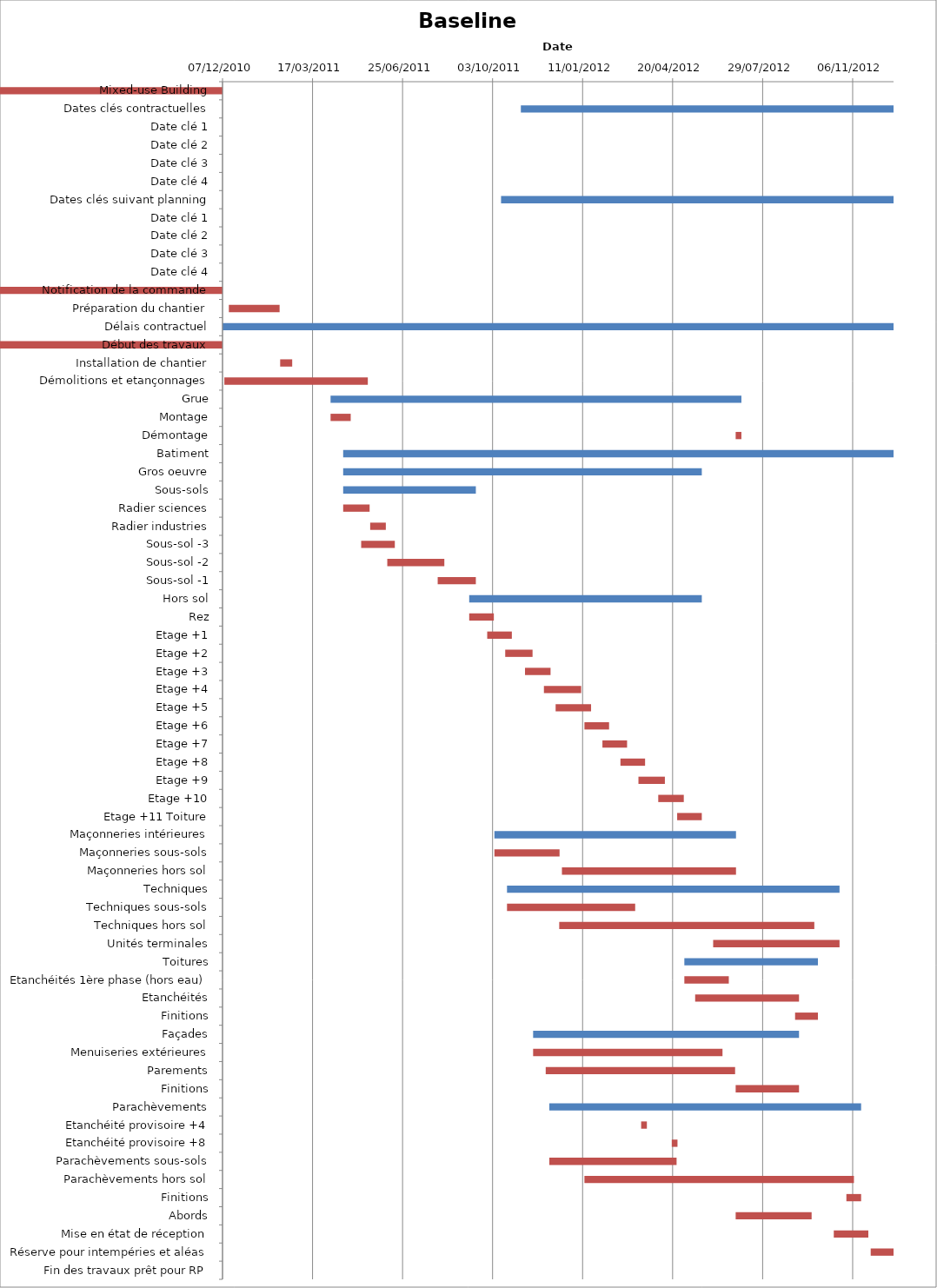
| Category | Baseline start | Actual duration |
|---|---|---|
| Mixed-use Building | 40519.333 | -0.625 |
| Dates clés contractuelles | 40850.708 | 414 |
| Date clé 1 | 40850.708 | 0 |
| Date clé 2 | 41094.708 | 0 |
| Date clé 3 | 41143.708 | 0 |
| Date clé 4 | 41264.708 | 0 |
| Dates clés suivant planning | 40828.708 | 436 |
| Date clé 1 | 40828.708 | 0 |
| Date clé 2 | 41086.708 | 0 |
| Date clé 3 | 41138.708 | 0 |
| Date clé 4 | 41264.708 | 0 |
| Notification de la commande | 40519.333 | -0.625 |
| Préparation du chantier | 40526.333 | 56.375 |
| Délais contractuel | 40519.333 | 745.375 |
| Début des travaux | 40519.333 | -0.625 |
| Installation de chantier | 40583.333 | 13.375 |
| Démolitions et etançonnages | 40521.333 | 159.375 |
| Grue | 40639.333 | 456.375 |
| Montage | 40639.333 | 22.375 |
| Démontage | 41089.333 | 6.375 |
| Batiment | 40653.333 | 611.375 |
| Gros oeuvre | 40653.333 | 398.375 |
| Sous-sols | 40653.333 | 147.375 |
| Radier sciences | 40653.333 | 29.375 |
| Radier industries | 40683.333 | 17.375 |
| Sous-sol -3 | 40673.333 | 37.375 |
| Sous-sol -2 | 40702.333 | 63.375 |
| Sous-sol -1 | 40758.333 | 42.375 |
| Hors sol | 40793.333 | 258.375 |
| Rez | 40793.333 | 27.375 |
| Etage +1 | 40813.333 | 27.375 |
| Etage +2 | 40833.333 | 30.375 |
| Etage +3 | 40855.333 | 28.375 |
| Etage +4 | 40876.333 | 41.375 |
| Etage +5 | 40889.333 | 39.375 |
| Etage +6 | 40921.333 | 27.375 |
| Etage +7 | 40941.333 | 27.375 |
| Etage +8 | 40961.333 | 27.375 |
| Etage +9 | 40981.333 | 29.375 |
| Etage +10 | 41003.333 | 28.375 |
| Etage +11 Toiture | 41024.333 | 27.375 |
| Maçonneries intérieures | 40821.333 | 268.375 |
| Maçonneries sous-sols | 40821.333 | 72.375 |
| Maçonneries hors sol | 40896.333 | 193.375 |
| Techniques | 40835.333 | 369.375 |
| Techniques sous-sols | 40835.333 | 142.375 |
| Techniques hors sol | 40893.333 | 283.375 |
| Unités terminales | 41064.333 | 140.375 |
| Toitures | 41032.333 | 148.375 |
| Etanchéités 1ère phase (hors eau) | 41032.333 | 49.375 |
| Etanchéités | 41044.333 | 115.375 |
| Finitions | 41155.333 | 25.375 |
| Façades | 40864.333 | 295.375 |
| Menuiseries extérieures | 40864.333 | 210.375 |
| Parements | 40878.333 | 210.375 |
| Finitions | 41089.333 | 70.375 |
| Parachèvements | 40882.333 | 346.375 |
| Etanchéité provisoire +4 | 40984.333 | 6.375 |
| Etanchéité provisoire +8 | 41018.333 | 6.375 |
| Parachèvements sous-sols | 40882.333 | 141.375 |
| Parachèvements hors sol | 40921.333 | 299.375 |
| Finitions | 41212.333 | 16.375 |
| Abords | 41089.333 | 84.375 |
| Mise en état de réception | 41198.333 | 38.375 |
| Réserve pour intempéries et aléas | 41239.333 | 25.375 |
| Fin des travaux prêt pour RP | 41264.708 | 0 |